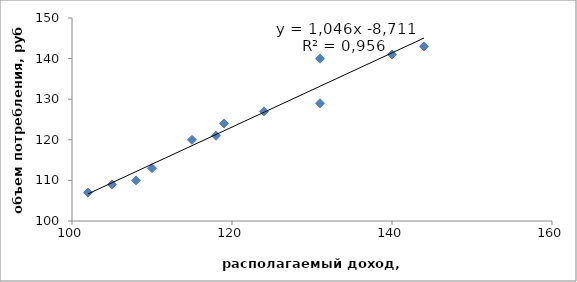
| Category | y |
|---|---|
| 102.0 | 107 |
| 105.0 | 109 |
| 108.0 | 110 |
| 110.0 | 113 |
| 115.0 | 120 |
| 118.0 | 121 |
| 119.0 | 124 |
| 124.0 | 127 |
| 131.0 | 129 |
| 131.0 | 140 |
| 140.0 | 141 |
| 144.0 | 143 |